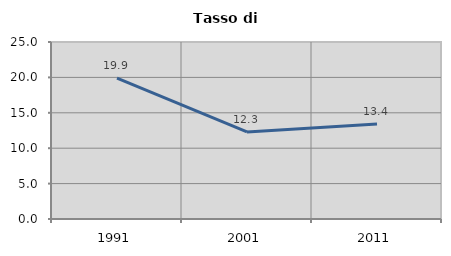
| Category | Tasso di disoccupazione   |
|---|---|
| 1991.0 | 19.889 |
| 2001.0 | 12.297 |
| 2011.0 | 13.425 |